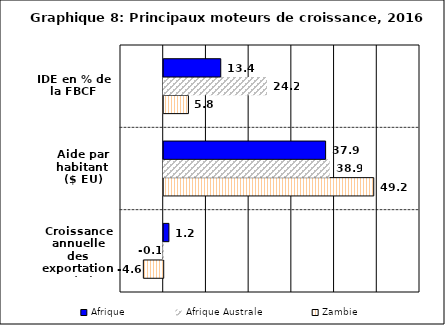
| Category | Zambie | Afrique Australe | Afrique |
|---|---|---|---|
| Croissance annuelle des exportations (%) | -4.65 | -0.056 | 1.219 |
| Aide par habitant ($ EU) | 49.17 | 38.854 | 37.904 |
| IDE en % de la FBCF | 5.784 | 24.179 | 13.354 |